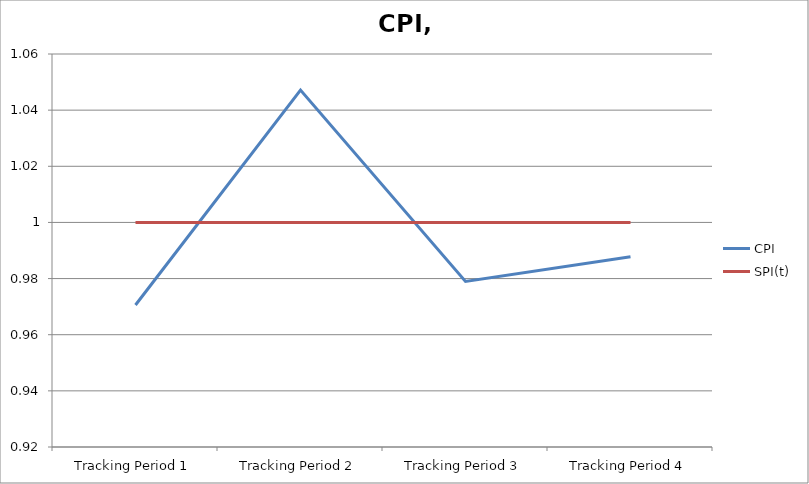
| Category | CPI | SPI(t) |
|---|---|---|
| Tracking Period 1 | 0.971 | 1 |
| Tracking Period 2 | 1.047 | 1 |
| Tracking Period 3 | 0.979 | 1 |
| Tracking Period 4 | 0.988 | 1 |